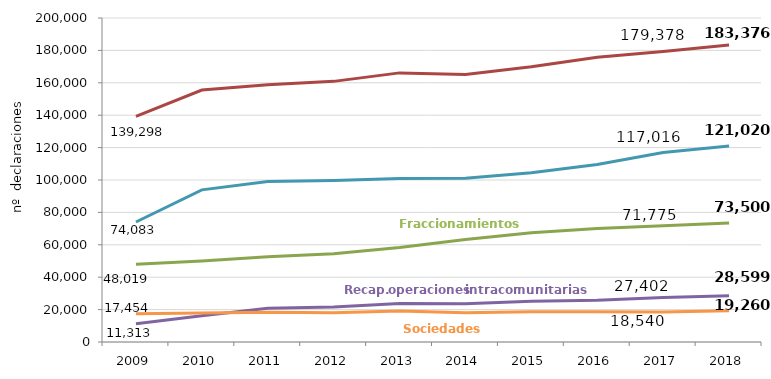
| Category | IVA | Fraccionamientos | Recapitulativa operaciones intracomunitarias | Informativas | Sociedades |
|---|---|---|---|---|---|
| 2009.0 | 139298 | 48019 | 11313 | 74083 | 17454 |
| 2010.0 | 155555 | 49976 | 16241 | 93924 | 17852 |
| 2011.0 | 158799 | 52600 | 20904 | 99132 | 18416 |
| 2012.0 | 160883 | 54438 | 21534 | 99711 | 18042 |
| 2013.0 | 166124 | 58345 | 23760 | 100895 | 19090 |
| 2014.0 | 165166 | 63305 | 23561 | 101111 | 18005 |
| 2015.0 | 169888 | 67411 | 25186 | 104491 | 18631 |
| 2016.0 | 175821 | 70118 | 25707 | 109620 | 18652 |
| 2017.0 | 179378 | 71775 | 27402 | 117016 | 18540 |
| 2018.0 | 183376 | 73500 | 28599 | 121020 | 19260 |